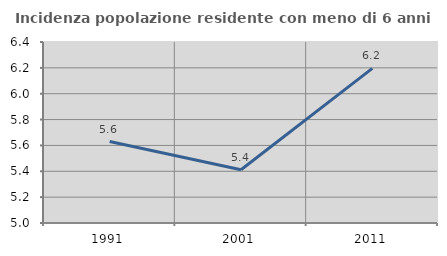
| Category | Incidenza popolazione residente con meno di 6 anni |
|---|---|
| 1991.0 | 5.63 |
| 2001.0 | 5.412 |
| 2011.0 | 6.196 |